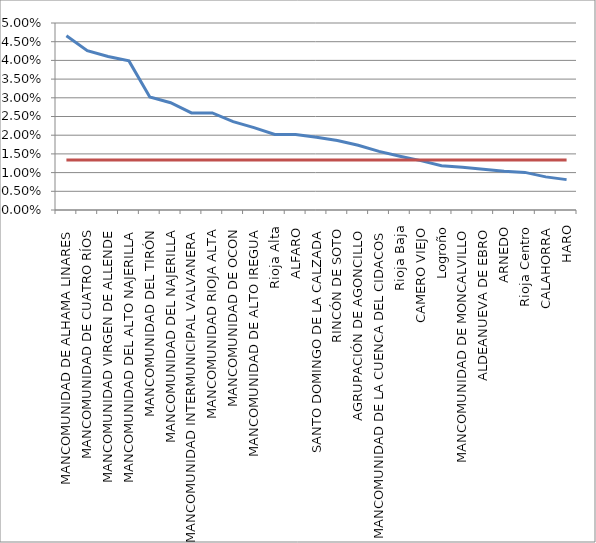
| Category | Series 0 | Series 1 |
|---|---|---|
| MANCOMUNIDAD DE ALHAMA LINARES | 0.047 | 0.013 |
| MANCOMUNIDAD DE CUATRO RÍOS | 0.043 | 0.013 |
| MANCOMUNIDAD VIRGEN DE ALLENDE | 0.041 | 0.013 |
| MANCOMUNIDAD DEL ALTO NAJERILLA | 0.04 | 0.013 |
| MANCOMUNIDAD DEL TIRÓN | 0.03 | 0.013 |
| MANCOMUNIDAD DEL NAJERILLA | 0.029 | 0.013 |
| MANCOMUNIDAD INTERMUNICIPAL VALVANERA | 0.026 | 0.013 |
| MANCOMUNIDAD RIOJA ALTA | 0.026 | 0.013 |
| MANCOMUNIDAD DE OCON | 0.024 | 0.013 |
| MANCOMUNIDAD DE ALTO IREGUA | 0.022 | 0.013 |
| Rioja Alta | 0.02 | 0.013 |
| ALFARO | 0.02 | 0.013 |
| SANTO DOMINGO DE LA CALZADA | 0.019 | 0.013 |
| RINCÓN DE SOTO | 0.019 | 0.013 |
| AGRUPACIÓN DE AGONCILLO | 0.017 | 0.013 |
| MANCOMUNIDAD DE LA CUENCA DEL CIDACOS | 0.016 | 0.013 |
| Rioja Baja | 0.014 | 0.013 |
| CAMERO VIEJO | 0.013 | 0.013 |
| Logroño | 0.012 | 0.013 |
| MANCOMUNIDAD DE MONCALVILLO | 0.011 | 0.013 |
| ALDEANUEVA DE EBRO | 0.011 | 0.013 |
| ARNEDO | 0.01 | 0.013 |
| Rioja Centro | 0.01 | 0.013 |
| CALAHORRA | 0.009 | 0.013 |
| HARO | 0.008 | 0.013 |